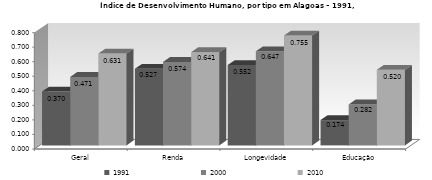
| Category | 1991 | 2000 | 2010 |
|---|---|---|---|
| Geral | 0.37 | 0.471 | 0.631 |
| Renda | 0.527 | 0.574 | 0.641 |
| Longevidade | 0.552 | 0.647 | 0.755 |
| Educação | 0.174 | 0.282 | 0.52 |